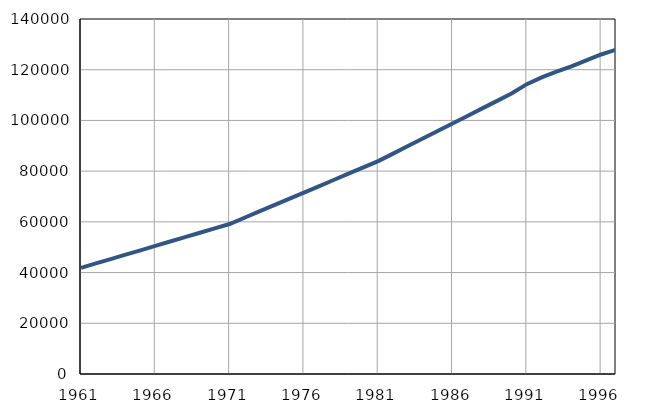
| Category | Број
становника |
|---|---|
| 1961.0 | 41881 |
| 1962.0 | 43607 |
| 1963.0 | 45333 |
| 1964.0 | 47059 |
| 1965.0 | 48785 |
| 1966.0 | 50511 |
| 1967.0 | 52237 |
| 1968.0 | 53963 |
| 1969.0 | 55689 |
| 1970.0 | 57415 |
| 1971.0 | 59140 |
| 1972.0 | 61621 |
| 1973.0 | 64102 |
| 1974.0 | 66583 |
| 1975.0 | 69064 |
| 1976.0 | 71545 |
| 1977.0 | 74026 |
| 1978.0 | 76507 |
| 1979.0 | 78988 |
| 1980.0 | 81469 |
| 1981.0 | 83945 |
| 1982.0 | 86917 |
| 1983.0 | 89889 |
| 1984.0 | 92861 |
| 1985.0 | 95833 |
| 1986.0 | 98805 |
| 1987.0 | 101777 |
| 1988.0 | 104749 |
| 1989.0 | 107721 |
| 1990.0 | 110693 |
| 1991.0 | 114300 |
| 1992.0 | 117000 |
| 1993.0 | 119200 |
| 1994.0 | 121300 |
| 1995.0 | 123700 |
| 1996.0 | 126000 |
| 1997.0 | 127900 |